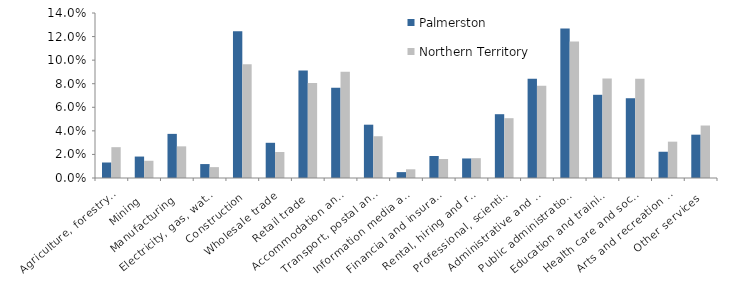
| Category | Palmerston | Northern Territory |
|---|---|---|
| Agriculture, forestry and fishing | 0.013 | 0.026 |
| Mining | 0.018 | 0.015 |
| Manufacturing | 0.037 | 0.027 |
| Electricity, gas, water and waste services | 0.012 | 0.009 |
| Construction | 0.125 | 0.097 |
| Wholesale trade | 0.03 | 0.022 |
| Retail trade | 0.091 | 0.081 |
| Accommodation and food services | 0.077 | 0.09 |
| Transport, postal and warehousing | 0.045 | 0.035 |
| Information media and telecommunications | 0.005 | 0.007 |
| Financial and insurance services | 0.019 | 0.016 |
| Rental, hiring and real estate services | 0.017 | 0.017 |
| Professional, scientific and technical services | 0.054 | 0.051 |
| Administrative and support services | 0.084 | 0.078 |
| Public administration and safety | 0.127 | 0.116 |
| Education and training | 0.071 | 0.084 |
| Health care and social assistance | 0.068 | 0.084 |
| Arts and recreation services | 0.022 | 0.031 |
| Other services | 0.037 | 0.045 |